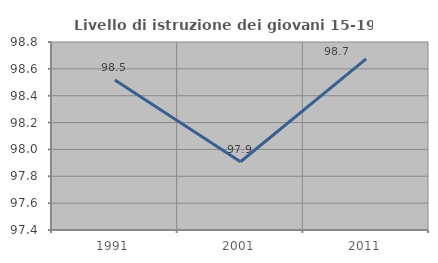
| Category | Livello di istruzione dei giovani 15-19 anni |
|---|---|
| 1991.0 | 98.516 |
| 2001.0 | 97.908 |
| 2011.0 | 98.674 |